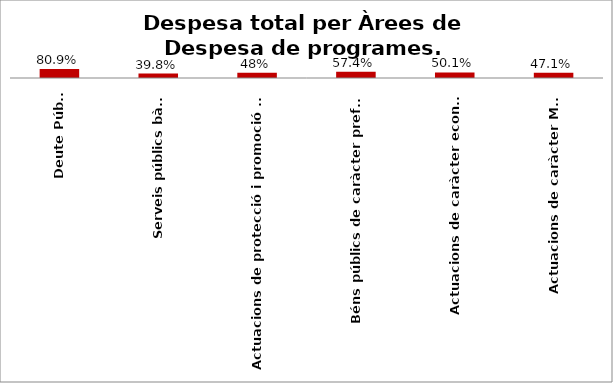
| Category | Series 0 |
|---|---|
| Deute Públic | 0.809 |
| Serveis públics bàsics | 0.398 |
| Actuacions de protecció i promoció social | 0.479 |
| Béns públics de caràcter preferent | 0.574 |
| Actuacions de caràcter econòmic | 0.501 |
| Actuacions de caràcter Marçal | 0.471 |